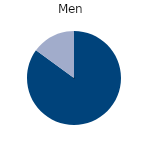
| Category | Men |
|---|---|
| Full time | 85 |
| Part time | 15 |